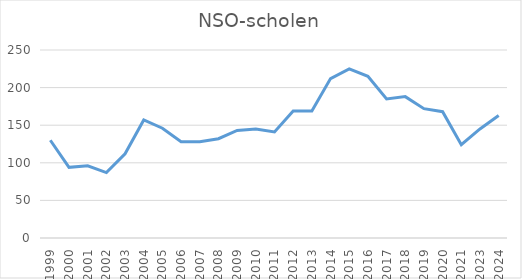
| Category | NSO-scholen |
|---|---|
| 1999.0 | 130 |
| 2000.0 | 94 |
| 2001.0 | 96 |
| 2002.0 | 87 |
| 2003.0 | 112 |
| 2004.0 | 157 |
| 2005.0 | 146 |
| 2006.0 | 128 |
| 2007.0 | 128 |
| 2008.0 | 132 |
| 2009.0 | 143 |
| 2010.0 | 145 |
| 2011.0 | 141 |
| 2012.0 | 169 |
| 2013.0 | 169 |
| 2014.0 | 212 |
| 2015.0 | 225 |
| 2016.0 | 215 |
| 2017.0 | 185 |
| 2018.0 | 188 |
| 2019.0 | 172 |
| 2020.0 | 168 |
| 2021.0 | 124 |
| 2023.0 | 145 |
| 2024.0 | 163 |